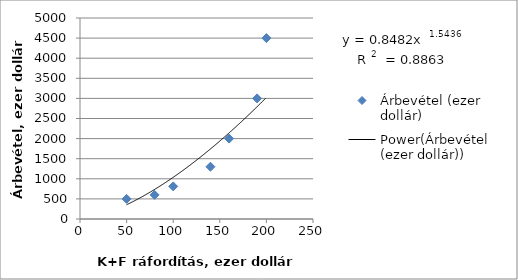
| Category | Árbevétel (ezer dollár) |
|---|---|
| 50.0 | 500 |
| 80.0 | 600 |
| 100.0 | 811 |
| 140.0 | 1300 |
| 160.0 | 2000 |
| 190.0 | 3000 |
| 200.0 | 4500 |